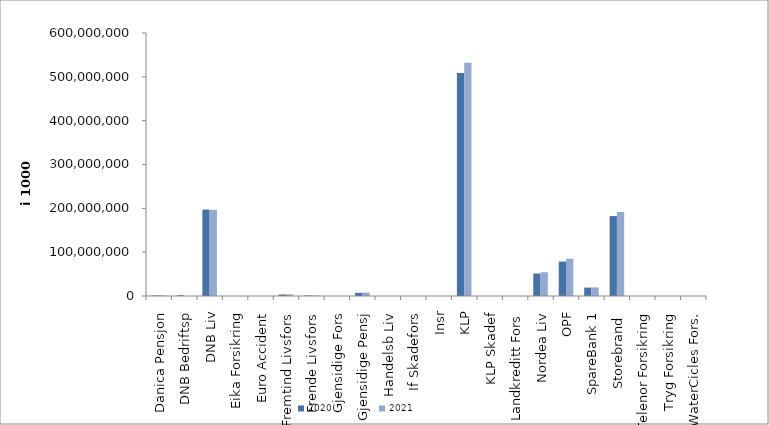
| Category | 2020 | 2021 |
|---|---|---|
| Danica Pensjon | 1183791.042 | 1351956.028 |
| DNB Bedriftsp | 1780872 | 0 |
| DNB Liv | 197164195.841 | 196590138.17 |
| Eika Forsikring | 0 | 0 |
| Euro Accident | 0 | 0 |
| Fremtind Livsfors | 3426723.594 | 3914911.946 |
| Frende Livsfors | 1243833 | 1220716 |
| Gjensidige Fors | 0 | 0 |
| Gjensidige Pensj | 7257458 | 7864328 |
| Handelsb Liv | 27018.358 | 18807.375 |
| If Skadefors | 0 | 0 |
| Insr | 0 | 0 |
| KLP | 508505466.93 | 532252570.113 |
| KLP Skadef | 39904.187 | 61664.775 |
| Landkreditt Fors | 0 | 0 |
| Nordea Liv | 51184490 | 54236300 |
| OPF | 78512396.265 | 84956302 |
| SpareBank 1 | 19224127.527 | 19627923.643 |
| Storebrand  | 182275775.578 | 191597306.794 |
| Telenor Forsikring | 0 | 0 |
| Tryg Forsikring | 0 | 0 |
| WaterCicles Fors. | 0 | 0 |